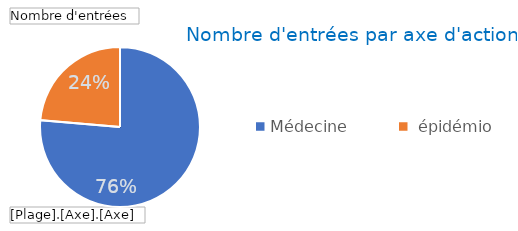
| Category | Total |
|---|---|
| Médecine, épidémio, stats. | 84 |
| Politique, juridique & finances. Media | 26 |